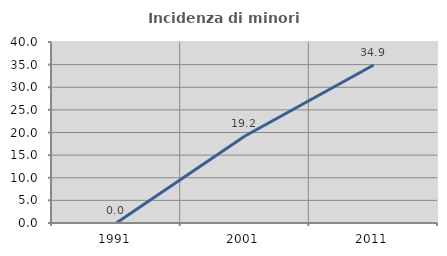
| Category | Incidenza di minori stranieri |
|---|---|
| 1991.0 | 0 |
| 2001.0 | 19.231 |
| 2011.0 | 34.926 |